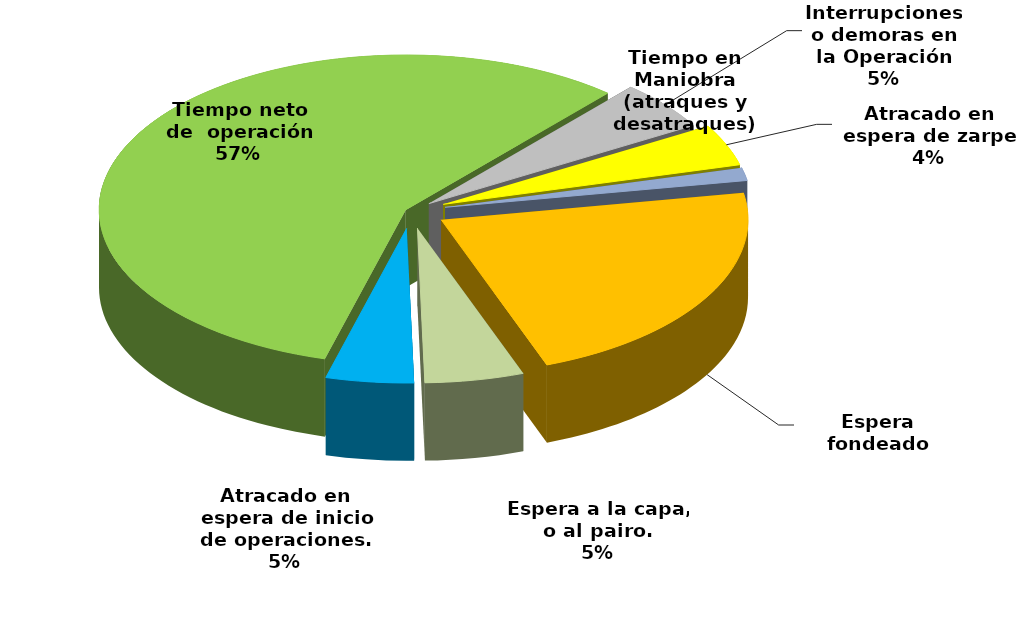
| Category | Series 0 |
|---|---|
| Espera fondeado | 41953.7 |
| Espera a la capa, o al pairo. | 9865.6 |
| Atracado en espera de inicio de operaciones. | 8763.675 |
| Tiempo neto de  operación | 108155.735 |
| Interrupciones o demoras en la Operación | 9702.22 |
| Atracado en espera de zarpe | 8182.902 |
| Tiempo en Maniobra (atraques y desatraques) | 2547.25 |